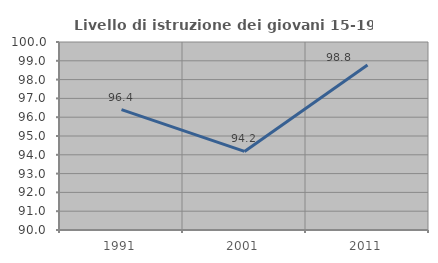
| Category | Livello di istruzione dei giovani 15-19 anni |
|---|---|
| 1991.0 | 96.403 |
| 2001.0 | 94.18 |
| 2011.0 | 98.78 |